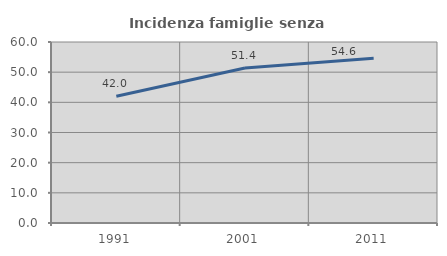
| Category | Incidenza famiglie senza nuclei |
|---|---|
| 1991.0 | 42.021 |
| 2001.0 | 51.351 |
| 2011.0 | 54.63 |